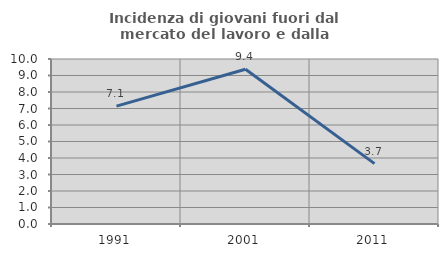
| Category | Incidenza di giovani fuori dal mercato del lavoro e dalla formazione  |
|---|---|
| 1991.0 | 7.143 |
| 2001.0 | 9.375 |
| 2011.0 | 3.659 |